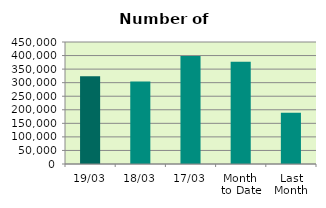
| Category | Series 0 |
|---|---|
| 19/03 | 324068 |
| 18/03 | 304564 |
| 17/03 | 398808 |
| Month 
to Date | 377060 |
| Last
Month | 188783.7 |